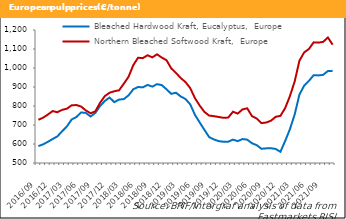
| Category | Bleached Hardwood Kraft, Eucalyptus,  Europe | Northern Bleached Softwood Kraft,  Europe |
|---|---|---|
| 2016/09 | 589.035 | 727.37 |
| 2016/10 | 598.135 | 738.6 |
| 2016/11 | 611.465 | 755.07 |
| 2016/12 | 626.19 | 773.245 |
| 2017/01 | 640.09 | 767.17 |
| 2017/02 | 666.82 | 779.52 |
| 2017/03 | 692.24 | 785.79 |
| 2017/04 | 728.66 | 803.4 |
| 2017/05 | 741.9 | 805.23 |
| 2017/06 | 766.02 | 797.2 |
| 2017/07 | 763.66 | 776.68 |
| 2017/08 | 744.82 | 761.75 |
| 2017/09 | 763.61 | 772 |
| 2017/10 | 799.87 | 816.89 |
| 2017/11 | 826.51 | 852.08 |
| 2017/12 | 844.62 | 869.96 |
| 2018/01 | 820.28 | 877.7 |
| 2018/02 | 833.97 | 882.55 |
| 2018/03 | 836.17 | 917.35 |
| 2018/04 | 855.92 | 953.74 |
| 2018/05 | 888.17 | 1015.06 |
| 2018/06 | 900 | 1054 |
| 2018/07 | 898 | 1052 |
| 2018/08 | 911 | 1067 |
| 2018/09 | 902 | 1056 |
| 2018/10 | 915 | 1072 |
| 2018/11 | 910 | 1055 |
| 2018/12 | 888 | 1041 |
| 2019/01 | 864 | 998 |
| 2019/02 | 870 | 974 |
| 2019/03 | 850 | 947 |
| 2019/04 | 837 | 926 |
| 2019/05 | 808.5 | 894 |
| 2019/06 | 753 | 841 |
| 2019/07 | 713 | 802 |
| 2019/08 | 674 | 768.5 |
| 2019/09 | 636 | 749.5 |
| 2019/10 | 624 | 746.5 |
| 2019/11 | 615 | 742 |
| 2019/12 | 612 | 738 |
| 2020/01 | 612 | 739 |
| 2020/02 | 623 | 770 |
| 2020/03 | 615 | 760 |
| 2020/04 | 626 | 782 |
| 2020/05 | 623 | 788 |
| 2020/06 | 604 | 747 |
| 2020/07 | 594 | 734 |
| 2020/08 | 575 | 710 |
| 2020/09 | 577 | 713 |
| 2020/10 | 578 | 722.5 |
| 2020/11 | 574 | 743 |
| 2020/12 | 559 | 748 |
| 2021/01 | 616 | 789 |
| 2021/02 | 678 | 852 |
| 2021/03 | 755 | 929 |
| 2021/04 | 860 | 1038 |
| 2021/05 | 907 | 1082 |
| 2021/06 | 932 | 1100 |
| 2021/07 | 962 | 1135 |
| 2021/08 | 961 | 1133.5 |
| 2021/09 | 964 | 1137.5 |
| 2021/10 | 984 | 1160.5 |
| 2021/11 | 985 | 1123 |